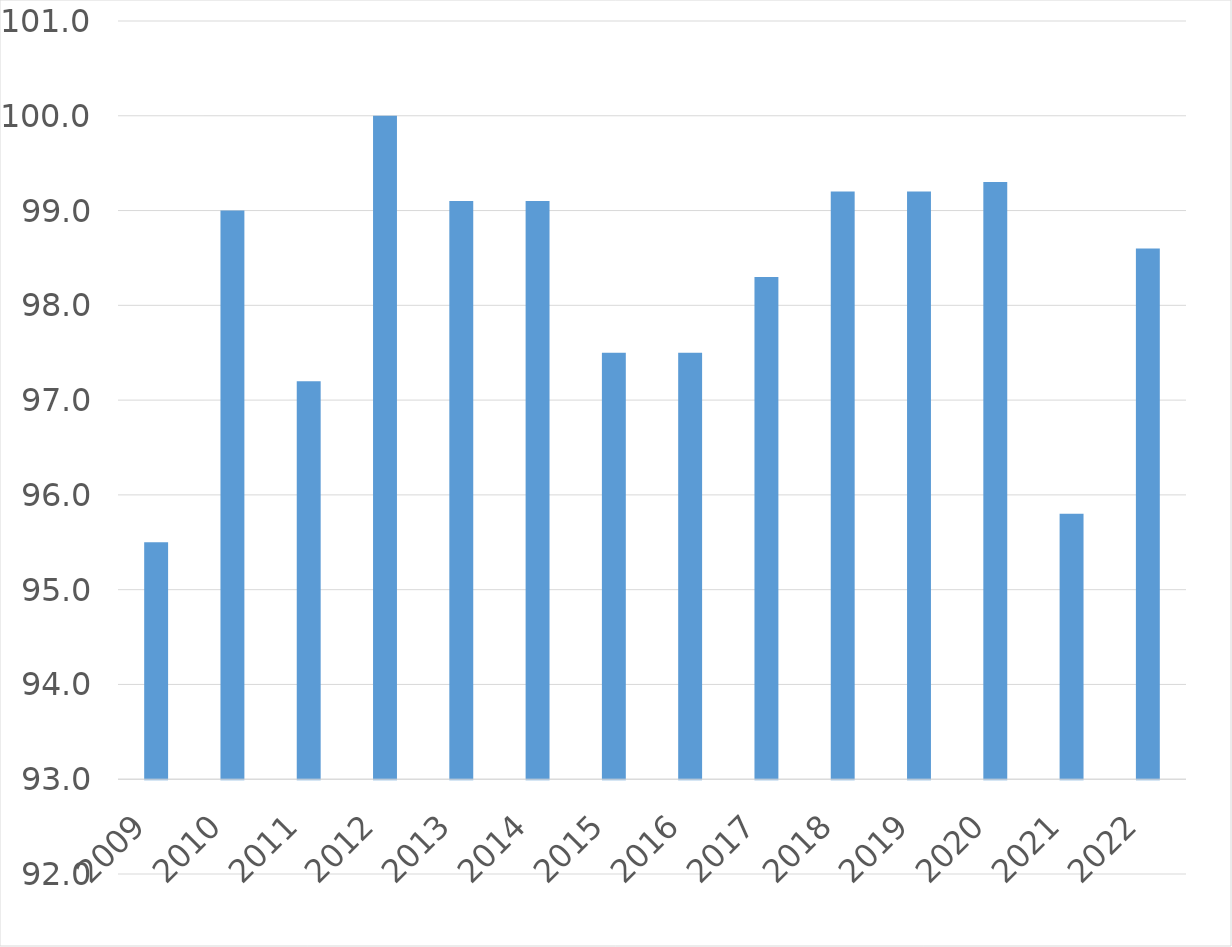
| Category | Series 0 |
|---|---|
| 2009 | 95.5 |
| 2010 | 99 |
| 2011 | 97.2 |
| 2012 | 100 |
| 2013 | 99.1 |
| 2014 | 99.1 |
| 2015 | 97.5 |
| 2016 | 97.5 |
| 2017 | 98.3 |
| 2018 | 99.2 |
| 2019 | 99.2 |
| 2020 | 99.3 |
| 2021 | 95.8 |
| 2022 | 98.6 |